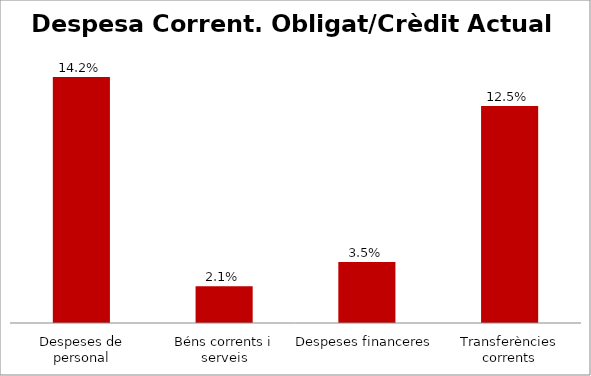
| Category | Series 0 |
|---|---|
| Despeses de personal | 0.142 |
| Béns corrents i serveis | 0.021 |
| Despeses financeres | 0.035 |
| Transferències corrents | 0.125 |